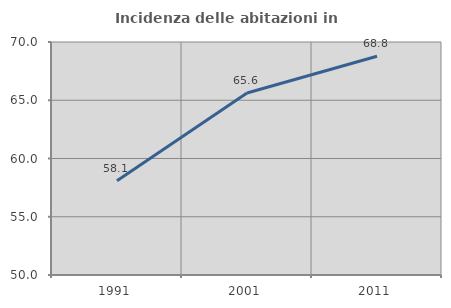
| Category | Incidenza delle abitazioni in proprietà  |
|---|---|
| 1991.0 | 58.089 |
| 2001.0 | 65.625 |
| 2011.0 | 68.78 |